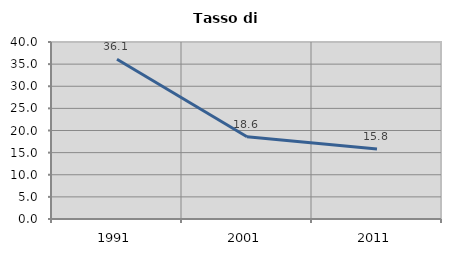
| Category | Tasso di disoccupazione   |
|---|---|
| 1991.0 | 36.096 |
| 2001.0 | 18.599 |
| 2011.0 | 15.824 |